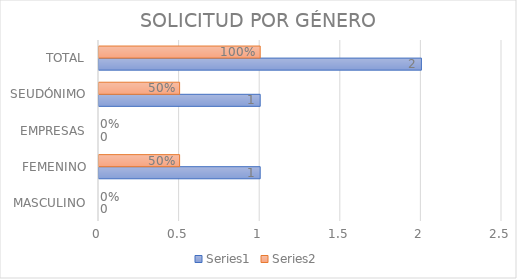
| Category | Series 0 | Series 1 |
|---|---|---|
| MASCULINO | 0 | 0 |
| FEMENINO | 1 | 0.5 |
| EMPRESAS | 0 | 0 |
| SEUDÓNIMO | 1 | 0.5 |
| TOTAL | 2 | 1 |